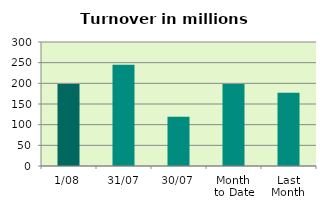
| Category | Series 0 |
|---|---|
| 1/08 | 198.582 |
| 31/07 | 245.095 |
| 30/07 | 118.904 |
| Month 
to Date | 198.582 |
| Last
Month | 177.022 |